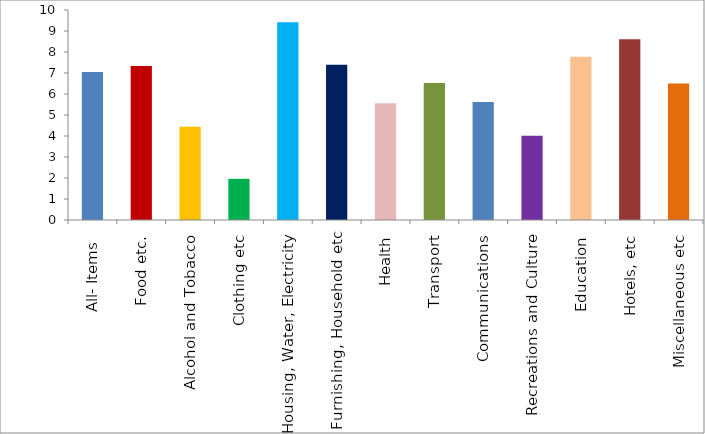
| Category | Series 0 |
|---|---|
| All- Items  | 7.05 |
| Food etc. | 7.339 |
| Alcohol and Tobacco | 4.438 |
| Clothing etc | 1.961 |
| Housing, Water, Electricity | 9.412 |
| Furnishing, Household etc | 7.395 |
| Health | 5.559 |
| Transport | 6.525 |
| Communications | 5.618 |
| Recreations and Culture | 4.013 |
| Education | 7.768 |
| Hotels, etc | 8.61 |
| Miscellaneous etc | 6.501 |